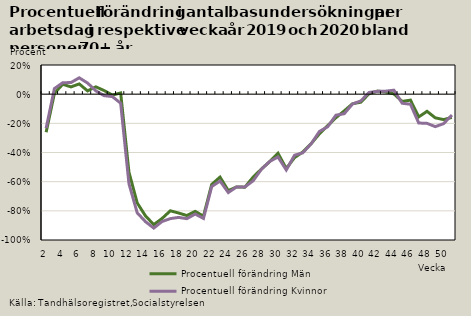
| Category | Procentuell förändring |
|---|---|
| 2.0 | -0.233 |
| 3.0 | 0.038 |
| 4.0 | 0.078 |
| 5.0 | 0.08 |
| 6.0 | 0.112 |
| 7.0 | 0.076 |
| 8.0 | 0.023 |
| 9.0 | -0.01 |
| 10.0 | -0.016 |
| 11.0 | -0.062 |
| 12.0 | -0.614 |
| 13.0 | -0.814 |
| 14.0 | -0.874 |
| 15.0 | -0.918 |
| 16.0 | -0.873 |
| 17.0 | -0.853 |
| 18.0 | -0.845 |
| 19.0 | -0.854 |
| 20.0 | -0.822 |
| 21.0 | -0.852 |
| 22.0 | -0.633 |
| 23.0 | -0.595 |
| 24.0 | -0.675 |
| 25.0 | -0.636 |
| 26.0 | -0.636 |
| 27.0 | -0.594 |
| 28.0 | -0.515 |
| 29.0 | -0.461 |
| 30.0 | -0.431 |
| 31.0 | -0.52 |
| 32.0 | -0.419 |
| 33.0 | -0.402 |
| 34.0 | -0.341 |
| 35.0 | -0.256 |
| 36.0 | -0.224 |
| 37.0 | -0.144 |
| 38.0 | -0.134 |
| 39.0 | -0.068 |
| 40.0 | -0.046 |
| 41.0 | 0.012 |
| 42.0 | 0.019 |
| 43.0 | 0.02 |
| 44.0 | 0.027 |
| 45.0 | -0.062 |
| 46.0 | -0.069 |
| 47.0 | -0.198 |
| 48.0 | -0.2 |
| 49.0 | -0.223 |
| 50.0 | -0.202 |
| 51.0 | -0.143 |